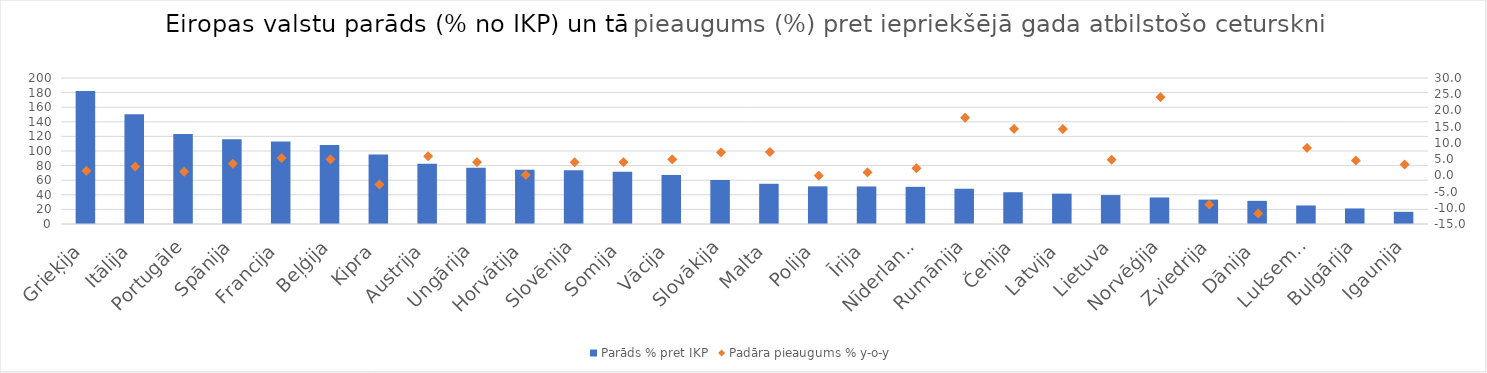
| Category | Parāds % pret IKP |
|---|---|
| Grieķija | 182.1 |
| Itālija | 150.2 |
| Portugāle | 123.4 |
| Spānija | 116.1 |
| Francija | 113.1 |
|  Beļģija | 108.3 |
| Kipra | 95.2 |
| Austrija | 82.7 |
| Ungārija | 77 |
| Horvātija | 74.3 |
| Slovēnija | 73.5 |
| Somija | 71.6 |
| Vācija | 67.2 |
| Slovākija | 60.3 |
| Malta | 55.1 |
| Polija | 51.6 |
| Īrija | 51.4 |
| Nīderlande | 50.9 |
| Rumānija | 48.3 |
| Čehija | 43.5 |
| Latvija | 41.6 |
| Lietuva | 39.6 |
| Norvēģija | 36.4 |
| Zviedrija | 33.4 |
| Dānija | 31.7 |
| Luksemburga | 25.4 |
| Bulgārija | 21.3 |
| Igaunija | 16.7 |